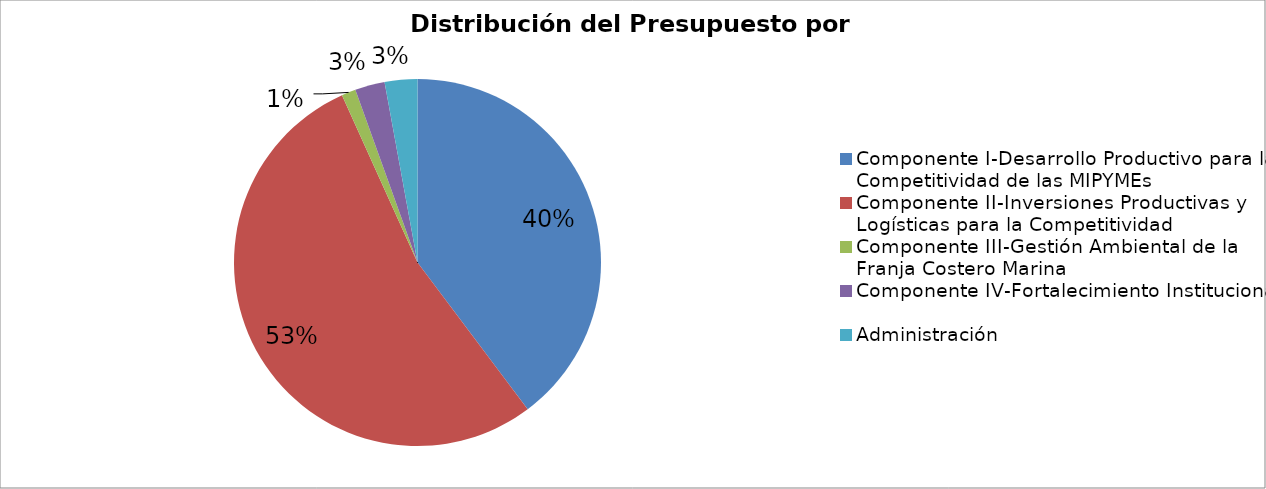
| Category | Costo Total US$ |
|---|---|
| Componente I-Desarrollo Productivo para la Competitividad de las MIPYMEs | 15900000 |
| Componente II-Inversiones Productivas y Logísticas para la Competitividad | 21400000 |
| Componente III-Gestión Ambiental de la Franja Costero Marina | 500000 |
| Componente IV-Fortalecimiento Institucional | 1050000 |
| Administración | 1150000 |